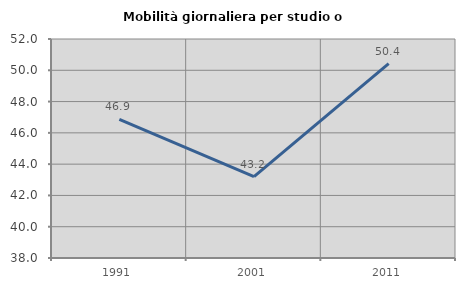
| Category | Mobilità giornaliera per studio o lavoro |
|---|---|
| 1991.0 | 46.865 |
| 2001.0 | 43.202 |
| 2011.0 | 50.432 |